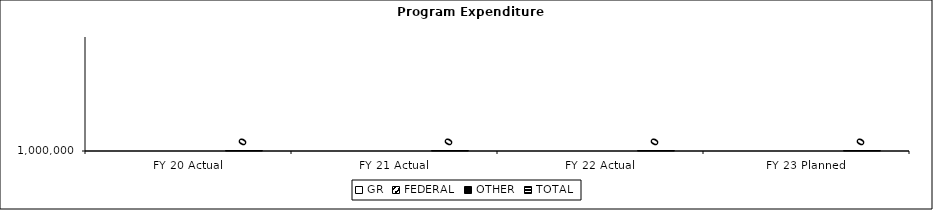
| Category | GR | FEDERAL | OTHER | TOTAL |
|---|---|---|---|---|
| FY 20 Actual |  |  |  | 0 |
| FY 21 Actual |  |  |  | 0 |
| FY 22 Actual |  |  |  | 0 |
| FY 23 Planned |  |  |  | 0 |